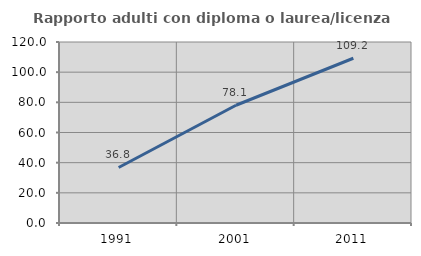
| Category | Rapporto adulti con diploma o laurea/licenza media  |
|---|---|
| 1991.0 | 36.82 |
| 2001.0 | 78.067 |
| 2011.0 | 109.225 |